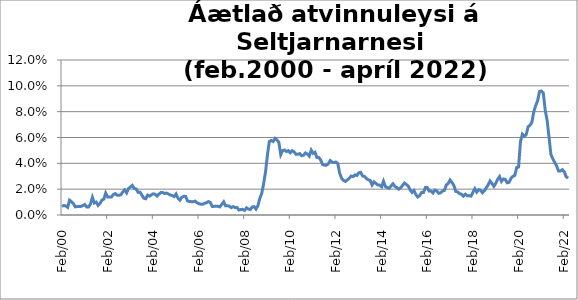
| Category | Series 0 |
|---|---|
| 2000-02-01 | 0.007 |
| 2000-03-01 | 0.007 |
| 2000-04-01 | 0.007 |
| 2000-05-01 | 0.006 |
| 2000-06-01 | 0.011 |
| 2000-07-01 | 0.01 |
| 2000-08-01 | 0.009 |
| 2000-09-01 | 0.006 |
| 2000-10-01 | 0.007 |
| 2000-11-01 | 0.007 |
| 2000-12-01 | 0.007 |
| 2001-01-01 | 0.007 |
| 2001-02-01 | 0.008 |
| 2001-03-01 | 0.006 |
| 2001-04-01 | 0.006 |
| 2001-05-01 | 0.008 |
| 2001-06-01 | 0.014 |
| 2001-07-01 | 0.009 |
| 2001-08-01 | 0.01 |
| 2001-09-01 | 0.007 |
| 2001-10-01 | 0.009 |
| 2001-11-01 | 0.012 |
| 2001-12-01 | 0.012 |
| 2002-01-01 | 0.017 |
| 2002-02-01 | 0.014 |
| 2002-03-01 | 0.014 |
| 2002-04-01 | 0.014 |
| 2002-05-01 | 0.016 |
| 2002-06-01 | 0.017 |
| 2002-07-01 | 0.015 |
| 2002-08-01 | 0.015 |
| 2002-09-01 | 0.016 |
| 2002-10-01 | 0.018 |
| 2002-11-01 | 0.019 |
| 2002-12-01 | 0.017 |
| 2003-01-01 | 0.021 |
| 2003-02-01 | 0.022 |
| 2003-03-01 | 0.023 |
| 2003-04-01 | 0.021 |
| 2003-05-01 | 0.02 |
| 2003-06-01 | 0.018 |
| 2003-07-01 | 0.018 |
| 2003-08-01 | 0.015 |
| 2003-09-01 | 0.013 |
| 2003-10-01 | 0.013 |
| 2003-11-01 | 0.015 |
| 2003-12-01 | 0.015 |
| 2004-01-01 | 0.016 |
| 2004-02-01 | 0.016 |
| 2004-03-01 | 0.016 |
| 2004-04-01 | 0.015 |
| 2004-05-01 | 0.016 |
| 2004-06-01 | 0.017 |
| 2004-07-01 | 0.017 |
| 2004-08-01 | 0.017 |
| 2004-09-01 | 0.017 |
| 2004-10-01 | 0.016 |
| 2004-11-01 | 0.015 |
| 2004-12-01 | 0.015 |
| 2005-01-01 | 0.014 |
| 2005-02-01 | 0.016 |
| 2005-03-01 | 0.013 |
| 2005-04-01 | 0.011 |
| 2005-05-01 | 0.014 |
| 2005-06-01 | 0.015 |
| 2005-07-01 | 0.014 |
| 2005-08-01 | 0.011 |
| 2005-09-01 | 0.011 |
| 2005-10-01 | 0.01 |
| 2005-11-01 | 0.01 |
| 2005-12-01 | 0.011 |
| 2006-01-01 | 0.01 |
| 2006-02-01 | 0.009 |
| 2006-03-01 | 0.008 |
| 2006-04-01 | 0.008 |
| 2006-05-01 | 0.009 |
| 2006-06-01 | 0.009 |
| 2006-07-01 | 0.01 |
| 2006-08-01 | 0.01 |
| 2006-09-01 | 0.007 |
| 2006-10-01 | 0.007 |
| 2006-11-01 | 0.007 |
| 2006-12-01 | 0.007 |
| 2007-01-01 | 0.006 |
| 2007-02-01 | 0.008 |
| 2007-03-01 | 0.01 |
| 2007-04-01 | 0.007 |
| 2007-05-01 | 0.007 |
| 2007-06-01 | 0.007 |
| 2007-07-01 | 0.006 |
| 2007-08-01 | 0.006 |
| 2007-09-01 | 0.006 |
| 2007-10-01 | 0.006 |
| 2007-11-01 | 0.004 |
| 2007-12-01 | 0.004 |
| 2008-01-01 | 0.004 |
| 2008-02-01 | 0.004 |
| 2008-03-01 | 0.006 |
| 2008-04-01 | 0.005 |
| 2008-05-01 | 0.004 |
| 2008-06-01 | 0.006 |
| 2008-07-01 | 0.006 |
| 2008-08-01 | 0.005 |
| 2008-09-01 | 0.007 |
| 2008-10-01 | 0.013 |
| 2008-11-01 | 0.017 |
| 2008-12-01 | 0.024 |
| 2009-01-01 | 0.033 |
| 2009-02-01 | 0.047 |
| 2009-03-01 | 0.057 |
| 2009-04-01 | 0.058 |
| 2009-05-01 | 0.057 |
| 2009-06-01 | 0.059 |
| 2009-07-01 | 0.058 |
| 2009-08-01 | 0.056 |
| 2009-09-01 | 0.047 |
| 2009-10-01 | 0.05 |
| 2009-11-01 | 0.05 |
| 2009-12-01 | 0.049 |
| 2010-01-01 | 0.05 |
| 2010-02-01 | 0.048 |
| 2010-03-01 | 0.05 |
| 2010-04-01 | 0.049 |
| 2010-05-01 | 0.047 |
| 2010-06-01 | 0.047 |
| 2010-07-01 | 0.048 |
| 2010-08-01 | 0.046 |
| 2010-09-01 | 0.046 |
| 2010-10-01 | 0.048 |
| 2010-11-01 | 0.047 |
| 2010-12-01 | 0.046 |
| 2011-01-01 | 0.05 |
| 2011-02-01 | 0.048 |
| 2011-03-01 | 0.049 |
| 2011-04-01 | 0.045 |
| 2011-05-01 | 0.045 |
| 2011-06-01 | 0.043 |
| 2011-07-01 | 0.039 |
| 2011-08-01 | 0.039 |
| 2011-09-01 | 0.039 |
| 2011-10-01 | 0.04 |
| 2011-11-01 | 0.042 |
| 2011-12-01 | 0.041 |
| 2012-01-01 | 0.041 |
| 2012-02-01 | 0.041 |
| 2012-03-01 | 0.04 |
| 2012-04-01 | 0.032 |
| 2012-05-01 | 0.028 |
| 2012-06-01 | 0.027 |
| 2012-07-01 | 0.026 |
| 2012-08-01 | 0.027 |
| 2012-09-01 | 0.028 |
| 2012-10-01 | 0.03 |
| 2012-11-01 | 0.03 |
| 2012-12-01 | 0.031 |
| 2013-01-01 | 0.031 |
| 2013-02-01 | 0.033 |
| 2013-03-01 | 0.033 |
| 2013-04-01 | 0.03 |
| 2013-05-01 | 0.03 |
| 2013-06-01 | 0.028 |
| 2013-07-01 | 0.027 |
| 2013-08-01 | 0.027 |
| 2013-09-01 | 0.023 |
| 2013-10-01 | 0.026 |
| 2013-11-01 | 0.024 |
| 2013-12-01 | 0.023 |
| 2014-01-01 | 0.023 |
| 2014-02-01 | 0.022 |
| 2014-03-01 | 0.026 |
| 2014-04-01 | 0.022 |
| 2014-05-01 | 0.021 |
| 2014-06-01 | 0.021 |
| 2014-07-01 | 0.023 |
| 2014-08-01 | 0.024 |
| 2014-09-01 | 0.022 |
| 2014-10-01 | 0.021 |
| 2014-11-01 | 0.02 |
| 2014-12-01 | 0.021 |
| 2015-01-01 | 0.023 |
| 2015-02-01 | 0.025 |
| 2015-03-01 | 0.024 |
| 2015-04-01 | 0.022 |
| 2015-05-01 | 0.019 |
| 2015-06-01 | 0.018 |
| 2015-07-01 | 0.019 |
| 2015-08-01 | 0.016 |
| 2015-09-01 | 0.014 |
| 2015-10-01 | 0.015 |
| 2015-11-01 | 0.017 |
| 2015-12-01 | 0.017 |
| 2016-01-01 | 0.021 |
| 2016-02-01 | 0.021 |
| 2016-03-01 | 0.019 |
| 2016-04-01 | 0.019 |
| 2016-05-01 | 0.017 |
| 2016-06-01 | 0.019 |
| 2016-07-01 | 0.019 |
| 2016-08-01 | 0.017 |
| 2016-09-01 | 0.017 |
| 2016-10-01 | 0.019 |
| 2016-11-01 | 0.019 |
| 2016-12-01 | 0.023 |
| 2017-01-01 | 0.024 |
| 2017-02-01 | 0.027 |
| 2017-03-01 | 0.025 |
| 2017-04-01 | 0.023 |
| 2017-05-01 | 0.018 |
| 2017-06-01 | 0.018 |
| 2017-07-01 | 0.016 |
| 2017-08-01 | 0.016 |
| 2017-09-01 | 0.015 |
| 2017-10-01 | 0.016 |
| 2017-11-01 | 0.015 |
| 2017-12-01 | 0.015 |
| 2018-01-01 | 0.015 |
| 2018-02-01 | 0.018 |
| 2018-03-01 | 0.02 |
| 2018-04-01 | 0.018 |
| 2018-05-01 | 0.02 |
| 2018-06-01 | 0.019 |
| 2018-07-01 | 0.017 |
| 2018-08-01 | 0.019 |
| 2018-09-01 | 0.021 |
| 2018-10-01 | 0.023 |
| 2018-11-01 | 0.026 |
| 2018-12-01 | 0.024 |
| 2019-01-01 | 0.022 |
| 2019-02-01 | 0.025 |
| 2019-03-01 | 0.028 |
| 2019-04-01 | 0.03 |
| 2019-05-01 | 0.026 |
| 2019-06-01 | 0.028 |
| 2019-07-01 | 0.028 |
| 2019-08-01 | 0.025 |
| 2019-09-01 | 0.025 |
| 2019-10-01 | 0.028 |
| 2019-11-01 | 0.03 |
| 2019-12-01 | 0.031 |
| 2020-01-01 | 0.037 |
| 2020-02-01 | 0.037 |
| 2020-03-01 | 0.057 |
| 2020-04-01 | 0.063 |
| 2020-05-01 | 0.061 |
| 2020-06-01 | 0.062 |
| 2020-07-01 | 0.068 |
| 2020-08-01 | 0.069 |
| 2020-09-01 | 0.072 |
| 2020-10-01 | 0.08 |
| 2020-11-01 | 0.085 |
| 2020-12-01 | 0.088 |
| 2021-01-01 | 0.096 |
| 2021-02-01 | 0.096 |
| 2021-03-01 | 0.094 |
| 2021-04-01 | 0.081 |
| 2021-05-01 | 0.073 |
| 2021-06-01 | 0.06 |
| 2021-07-01 | 0.047 |
| 2021-08-01 | 0.043 |
| 2021-09-01 | 0.041 |
| 2021-10-01 | 0.038 |
| 2021-11-01 | 0.034 |
| 2021-12-01 | 0.034 |
| 2022-01-01 | 0.035 |
| 2022-02-01 | 0.034 |
| 2022-03-01 | 0.03 |
| 2022-04-01 | 0.028 |